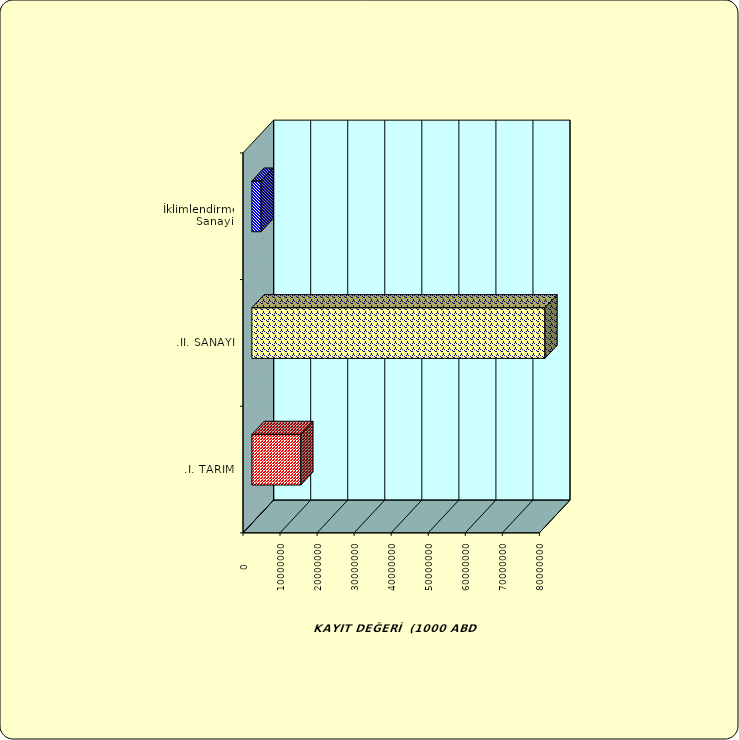
| Category | Series 0 |
|---|---|
| .I. TARIM | 13205225.256 |
| .II. SANAYİ | 79110372.88 |
|  İklimlendirme Sanayii | 2484455.219 |